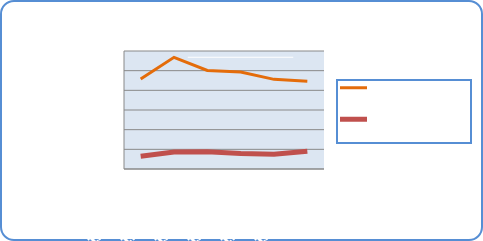
| Category | Motorin Türleri  | Benzin Türleri |
|---|---|---|
| 12/24/18 | 45703569.441 | 6499529.093 |
| 12/25/18 | 56766812.552 | 8681938.805 |
| 12/26/18 | 50112911.67 | 8800028.856 |
| 12/27/18 | 49331547.027 | 7865378.844 |
| 12/28/18 | 45577479.721 | 7493174.218 |
| 12/29/18 | 44675488.499 | 9054950.031 |